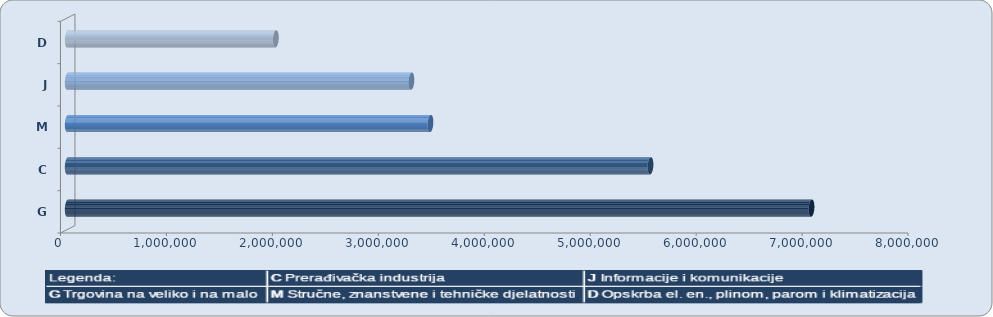
| Category | Series 0 |
|---|---|
| G | 7020425.954 |
| C | 5500742.182 |
| M | 3423970.123 |
| J | 3244355.309 |
| D | 1964527.14 |